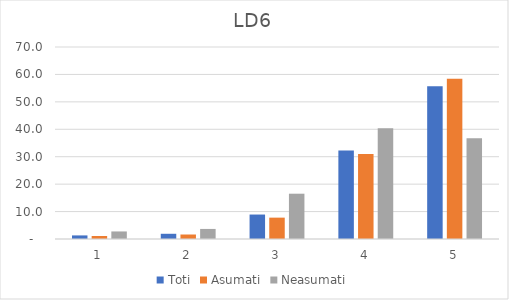
| Category | Toti | Asumati | Neasumati |
|---|---|---|---|
| 0 | 1.308 | 1.093 | 2.752 |
| 1 | 1.902 | 1.639 | 3.67 |
| 2 | 8.918 | 7.787 | 16.514 |
| 3 | 32.224 | 31.011 | 40.367 |
| 4 | 55.648 | 58.47 | 36.697 |